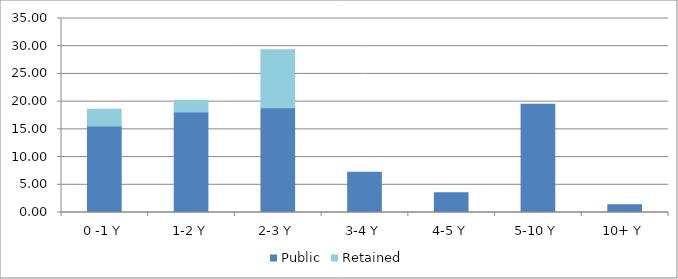
| Category | Public | Retained |
|---|---|---|
| 0 -1 Y | 15.621 | 2.985 |
| 1-2 Y | 18.14 | 2.098 |
| 2-3 Y | 18.886 | 10.492 |
| 3-4 Y | 7.266 | 0 |
| 4-5 Y | 3.574 | 0 |
| 5-10 Y | 19.539 | 0 |
| 10+ Y | 1.399 | 0 |